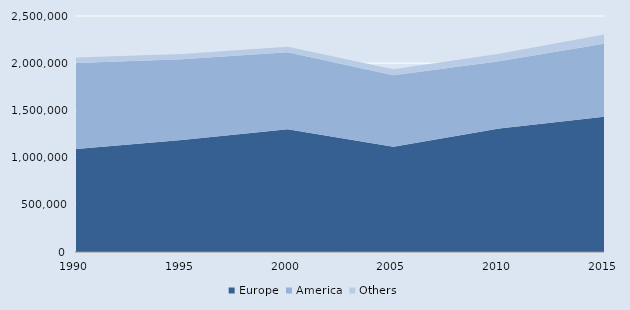
| Category | Europe | America | Others |
|---|---|---|---|
| 1990.0 | 1092141 | 910907 | 57742 |
| 1995.0 | 1187356 | 853198 | 56635 |
| 2000.0 | 1301084 | 815315 | 58045 |
| 2005.0 | 1114618 | 758905 | 62543 |
| 2010.0 | 1308130 | 712886 | 77881 |
| 2015.0 | 1433482 | 775050 | 97789 |